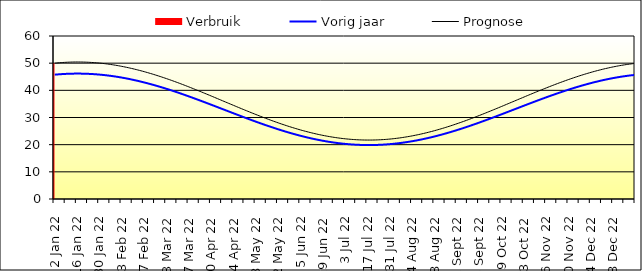
| Category | Verbruik |
|---|---|
| 2022-01-02 | 50 |
| 2022-01-03 | 0 |
| 2022-01-04 | 0 |
| 2022-01-05 | 0 |
| 2022-01-06 | 0 |
| 2022-01-07 | 0 |
| 2022-01-08 | 0 |
| 2022-01-09 | 0 |
| 2022-01-10 | 0 |
| 2022-01-11 | 0 |
| 2022-01-12 | 0 |
| 2022-01-13 | 0 |
| 2022-01-14 | 0 |
| 2022-01-15 | 0 |
| 2022-01-16 | 0 |
| 2022-01-17 | 0 |
| 2022-01-18 | 0 |
| 2022-01-19 | 0 |
| 2022-01-20 | 0 |
| 2022-01-21 | 0 |
| 2022-01-22 | 0 |
| 2022-01-23 | 0 |
| 2022-01-24 | 0 |
| 2022-01-25 | 0 |
| 2022-01-26 | 0 |
| 2022-01-27 | 0 |
| 2022-01-28 | 0 |
| 2022-01-29 | 0 |
| 2022-01-30 | 0 |
| 2022-01-31 | 0 |
| 2022-02-01 | 0 |
| 2022-02-02 | 0 |
| 2022-02-03 | 0 |
| 2022-02-04 | 0 |
| 2022-02-05 | 0 |
| 2022-02-06 | 0 |
| 2022-02-07 | 0 |
| 2022-02-08 | 0 |
| 2022-02-09 | 0 |
| 2022-02-10 | 0 |
| 2022-02-11 | 0 |
| 2022-02-12 | 0 |
| 2022-02-13 | 0 |
| 2022-02-14 | 0 |
| 2022-02-15 | 0 |
| 2022-02-16 | 0 |
| 2022-02-17 | 0 |
| 2022-02-18 | 0 |
| 2022-02-19 | 0 |
| 2022-02-20 | 0 |
| 2022-02-21 | 0 |
| 2022-02-22 | 0 |
| 2022-02-23 | 0 |
| 2022-02-24 | 0 |
| 2022-02-25 | 0 |
| 2022-02-26 | 0 |
| 2022-02-27 | 0 |
| 2022-02-28 | 0 |
| 2022-03-01 | 0 |
| 2022-03-02 | 0 |
| 2022-03-03 | 0 |
| 2022-03-04 | 0 |
| 2022-03-05 | 0 |
| 2022-03-06 | 0 |
| 2022-03-07 | 0 |
| 2022-03-08 | 0 |
| 2022-03-09 | 0 |
| 2022-03-10 | 0 |
| 2022-03-11 | 0 |
| 2022-03-12 | 0 |
| 2022-03-13 | 0 |
| 2022-03-14 | 0 |
| 2022-03-15 | 0 |
| 2022-03-16 | 0 |
| 2022-03-17 | 0 |
| 2022-03-18 | 0 |
| 2022-03-19 | 0 |
| 2022-03-20 | 0 |
| 2022-03-21 | 0 |
| 2022-03-22 | 0 |
| 2022-03-23 | 0 |
| 2022-03-24 | 0 |
| 2022-03-25 | 0 |
| 2022-03-26 | 0 |
| 2022-03-27 | 0 |
| 2022-03-28 | 0 |
| 2022-03-29 | 0 |
| 2022-03-30 | 0 |
| 2022-03-31 | 0 |
| 2022-04-01 | 0 |
| 2022-04-02 | 0 |
| 2022-04-03 | 0 |
| 2022-04-04 | 0 |
| 2022-04-05 | 0 |
| 2022-04-06 | 0 |
| 2022-04-07 | 0 |
| 2022-04-08 | 0 |
| 2022-04-09 | 0 |
| 2022-04-10 | 0 |
| 2022-04-11 | 0 |
| 2022-04-12 | 0 |
| 2022-04-13 | 0 |
| 2022-04-14 | 0 |
| 2022-04-15 | 0 |
| 2022-04-16 | 0 |
| 2022-04-17 | 0 |
| 2022-04-18 | 0 |
| 2022-04-19 | 0 |
| 2022-04-20 | 0 |
| 2022-04-21 | 0 |
| 2022-04-22 | 0 |
| 2022-04-23 | 0 |
| 2022-04-24 | 0 |
| 2022-04-25 | 0 |
| 2022-04-26 | 0 |
| 2022-04-27 | 0 |
| 2022-04-28 | 0 |
| 2022-04-29 | 0 |
| 2022-04-30 | 0 |
| 2022-05-01 | 0 |
| 2022-05-02 | 0 |
| 2022-05-03 | 0 |
| 2022-05-04 | 0 |
| 2022-05-05 | 0 |
| 2022-05-06 | 0 |
| 2022-05-07 | 0 |
| 2022-05-08 | 0 |
| 2022-05-09 | 0 |
| 2022-05-10 | 0 |
| 2022-05-11 | 0 |
| 2022-05-12 | 0 |
| 2022-05-13 | 0 |
| 2022-05-14 | 0 |
| 2022-05-15 | 0 |
| 2022-05-16 | 0 |
| 2022-05-17 | 0 |
| 2022-05-18 | 0 |
| 2022-05-19 | 0 |
| 2022-05-20 | 0 |
| 2022-05-21 | 0 |
| 2022-05-22 | 0 |
| 2022-05-23 | 0 |
| 2022-05-24 | 0 |
| 2022-05-25 | 0 |
| 2022-05-26 | 0 |
| 2022-05-27 | 0 |
| 2022-05-28 | 0 |
| 2022-05-29 | 0 |
| 2022-05-30 | 0 |
| 2022-05-31 | 0 |
| 2022-06-01 | 0 |
| 2022-06-02 | 0 |
| 2022-06-03 | 0 |
| 2022-06-04 | 0 |
| 2022-06-05 | 0 |
| 2022-06-06 | 0 |
| 2022-06-07 | 0 |
| 2022-06-08 | 0 |
| 2022-06-09 | 0 |
| 2022-06-10 | 0 |
| 2022-06-11 | 0 |
| 2022-06-12 | 0 |
| 2022-06-13 | 0 |
| 2022-06-14 | 0 |
| 2022-06-15 | 0 |
| 2022-06-16 | 0 |
| 2022-06-17 | 0 |
| 2022-06-18 | 0 |
| 2022-06-19 | 0 |
| 2022-06-20 | 0 |
| 2022-06-21 | 0 |
| 2022-06-22 | 0 |
| 2022-06-23 | 0 |
| 2022-06-24 | 0 |
| 2022-06-25 | 0 |
| 2022-06-26 | 0 |
| 2022-06-27 | 0 |
| 2022-06-28 | 0 |
| 2022-06-29 | 0 |
| 2022-06-30 | 0 |
| 2022-07-01 | 0 |
| 2022-07-02 | 0 |
| 2022-07-03 | 0 |
| 2022-07-04 | 0 |
| 2022-07-05 | 0 |
| 2022-07-06 | 0 |
| 2022-07-07 | 0 |
| 2022-07-08 | 0 |
| 2022-07-09 | 0 |
| 2022-07-10 | 0 |
| 2022-07-11 | 0 |
| 2022-07-12 | 0 |
| 2022-07-13 | 0 |
| 2022-07-14 | 0 |
| 2022-07-15 | 0 |
| 2022-07-16 | 0 |
| 2022-07-17 | 0 |
| 2022-07-18 | 0 |
| 2022-07-19 | 0 |
| 2022-07-20 | 0 |
| 2022-07-21 | 0 |
| 2022-07-22 | 0 |
| 2022-07-23 | 0 |
| 2022-07-24 | 0 |
| 2022-07-25 | 0 |
| 2022-07-26 | 0 |
| 2022-07-27 | 0 |
| 2022-07-28 | 0 |
| 2022-07-29 | 0 |
| 2022-07-30 | 0 |
| 2022-07-31 | 0 |
| 2022-08-01 | 0 |
| 2022-08-02 | 0 |
| 2022-08-03 | 0 |
| 2022-08-04 | 0 |
| 2022-08-05 | 0 |
| 2022-08-06 | 0 |
| 2022-08-07 | 0 |
| 2022-08-08 | 0 |
| 2022-08-09 | 0 |
| 2022-08-10 | 0 |
| 2022-08-11 | 0 |
| 2022-08-12 | 0 |
| 2022-08-13 | 0 |
| 2022-08-14 | 0 |
| 2022-08-15 | 0 |
| 2022-08-16 | 0 |
| 2022-08-17 | 0 |
| 2022-08-18 | 0 |
| 2022-08-19 | 0 |
| 2022-08-20 | 0 |
| 2022-08-21 | 0 |
| 2022-08-22 | 0 |
| 2022-08-23 | 0 |
| 2022-08-24 | 0 |
| 2022-08-25 | 0 |
| 2022-08-26 | 0 |
| 2022-08-27 | 0 |
| 2022-08-28 | 0 |
| 2022-08-29 | 0 |
| 2022-08-30 | 0 |
| 2022-08-31 | 0 |
| 2022-09-01 | 0 |
| 2022-09-02 | 0 |
| 2022-09-03 | 0 |
| 2022-09-04 | 0 |
| 2022-09-05 | 0 |
| 2022-09-06 | 0 |
| 2022-09-07 | 0 |
| 2022-09-08 | 0 |
| 2022-09-09 | 0 |
| 2022-09-10 | 0 |
| 2022-09-11 | 0 |
| 2022-09-12 | 0 |
| 2022-09-13 | 0 |
| 2022-09-14 | 0 |
| 2022-09-15 | 0 |
| 2022-09-16 | 0 |
| 2022-09-17 | 0 |
| 2022-09-18 | 0 |
| 2022-09-19 | 0 |
| 2022-09-20 | 0 |
| 2022-09-21 | 0 |
| 2022-09-22 | 0 |
| 2022-09-23 | 0 |
| 2022-09-24 | 0 |
| 2022-09-25 | 0 |
| 2022-09-26 | 0 |
| 2022-09-27 | 0 |
| 2022-09-28 | 0 |
| 2022-09-29 | 0 |
| 2022-09-30 | 0 |
| 2022-10-01 | 0 |
| 2022-10-02 | 0 |
| 2022-10-03 | 0 |
| 2022-10-04 | 0 |
| 2022-10-05 | 0 |
| 2022-10-06 | 0 |
| 2022-10-07 | 0 |
| 2022-10-08 | 0 |
| 2022-10-09 | 0 |
| 2022-10-10 | 0 |
| 2022-10-11 | 0 |
| 2022-10-12 | 0 |
| 2022-10-13 | 0 |
| 2022-10-14 | 0 |
| 2022-10-15 | 0 |
| 2022-10-16 | 0 |
| 2022-10-17 | 0 |
| 2022-10-18 | 0 |
| 2022-10-19 | 0 |
| 2022-10-20 | 0 |
| 2022-10-21 | 0 |
| 2022-10-22 | 0 |
| 2022-10-23 | 0 |
| 2022-10-24 | 0 |
| 2022-10-25 | 0 |
| 2022-10-26 | 0 |
| 2022-10-27 | 0 |
| 2022-10-28 | 0 |
| 2022-10-29 | 0 |
| 2022-10-30 | 0 |
| 2022-10-31 | 0 |
| 2022-11-01 | 0 |
| 2022-11-02 | 0 |
| 2022-11-03 | 0 |
| 2022-11-04 | 0 |
| 2022-11-05 | 0 |
| 2022-11-06 | 0 |
| 2022-11-07 | 0 |
| 2022-11-08 | 0 |
| 2022-11-09 | 0 |
| 2022-11-10 | 0 |
| 2022-11-11 | 0 |
| 2022-11-12 | 0 |
| 2022-11-13 | 0 |
| 2022-11-14 | 0 |
| 2022-11-15 | 0 |
| 2022-11-16 | 0 |
| 2022-11-17 | 0 |
| 2022-11-18 | 0 |
| 2022-11-19 | 0 |
| 2022-11-20 | 0 |
| 2022-11-21 | 0 |
| 2022-11-22 | 0 |
| 2022-11-23 | 0 |
| 2022-11-24 | 0 |
| 2022-11-25 | 0 |
| 2022-11-26 | 0 |
| 2022-11-27 | 0 |
| 2022-11-28 | 0 |
| 2022-11-29 | 0 |
| 2022-11-30 | 0 |
| 2022-12-01 | 0 |
| 2022-12-02 | 0 |
| 2022-12-03 | 0 |
| 2022-12-04 | 0 |
| 2022-12-05 | 0 |
| 2022-12-06 | 0 |
| 2022-12-07 | 0 |
| 2022-12-08 | 0 |
| 2022-12-09 | 0 |
| 2022-12-10 | 0 |
| 2022-12-11 | 0 |
| 2022-12-12 | 0 |
| 2022-12-13 | 0 |
| 2022-12-14 | 0 |
| 2022-12-15 | 0 |
| 2022-12-16 | 0 |
| 2022-12-17 | 0 |
| 2022-12-18 | 0 |
| 2022-12-19 | 0 |
| 2022-12-20 | 0 |
| 2022-12-21 | 0 |
| 2022-12-22 | 0 |
| 2022-12-23 | 0 |
| 2022-12-24 | 0 |
| 2022-12-25 | 0 |
| 2022-12-26 | 0 |
| 2022-12-27 | 0 |
| 2022-12-28 | 0 |
| 2022-12-29 | 0 |
| 2022-12-30 | 0 |
| 2022-12-31 | 0 |